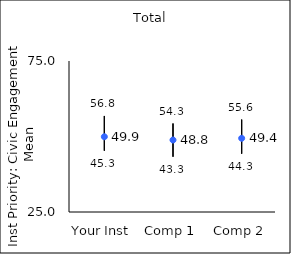
| Category | 25th percentile | 75th percentile | Mean |
|---|---|---|---|
| Your Inst | 45.3 | 56.8 | 49.92 |
| Comp 1 | 43.3 | 54.3 | 48.84 |
| Comp 2 | 44.3 | 55.6 | 49.41 |